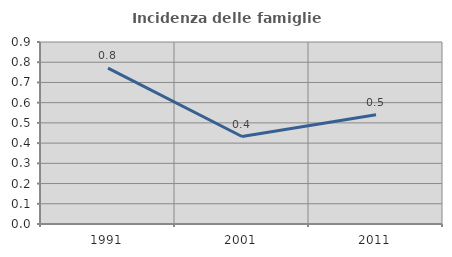
| Category | Incidenza delle famiglie numerose |
|---|---|
| 1991.0 | 0.771 |
| 2001.0 | 0.433 |
| 2011.0 | 0.54 |